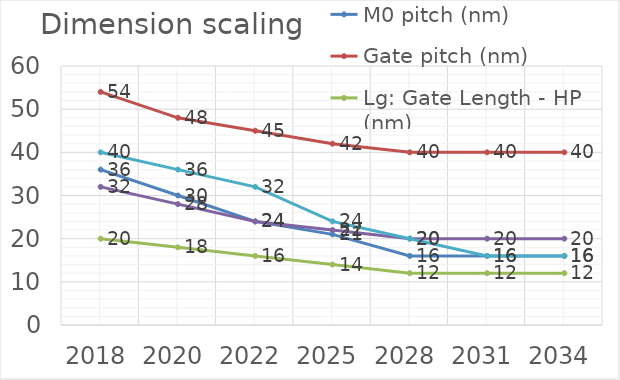
| Category | M0 pitch (nm) | Gate pitch (nm) | Lg: Gate Length - HP (nm) | Device lateral pitch (nm) | Mx pitch (nm) |
|---|---|---|---|---|---|
| 2018.0 | 36 | 54 | 20 | 32 | 40 |
| 2020.0 | 30 | 48 | 18 | 28 | 36 |
| 2022.0 | 24 | 45 | 16 | 24 | 32 |
| 2025.0 | 21 | 42 | 14 | 22 | 24 |
| 2028.0 | 16 | 40 | 12 | 20 | 20 |
| 2031.0 | 16 | 40 | 12 | 20 | 16 |
| 2034.0 | 16 | 40 | 12 | 20 | 16 |